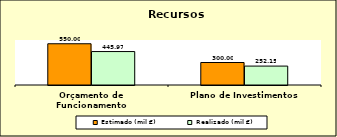
| Category | Estimado (mil €) | Realizado (mil €) |
|---|---|---|
| Orçamento de Funcionamento | 550 | 445.965 |
| Plano de Investimentos | 300 | 252.153 |